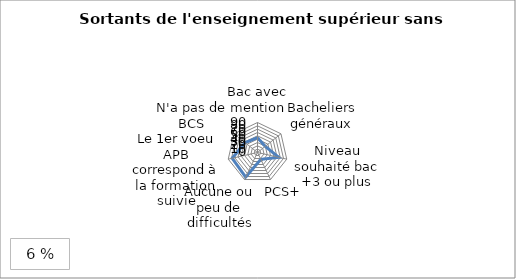
| Category | Sortants de l'enseignement supérieur sans diplôme |
|---|---|
| Bac avec mention | 44.4 |
| Bacheliers généraux | 29.7 |
| Niveau souhaité bac +3 ou plus | 65.4 |
| PCS+ | 22.8 |
| Aucune ou peu de difficultés | 81.9 |
| Le 1er voeu APB correspond à la formation suivie | 77.8 |
| N'a pas de BCS | 47.6 |